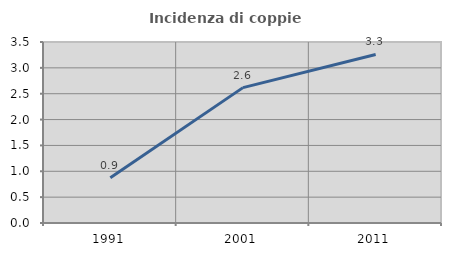
| Category | Incidenza di coppie miste |
|---|---|
| 1991.0 | 0.874 |
| 2001.0 | 2.618 |
| 2011.0 | 3.259 |